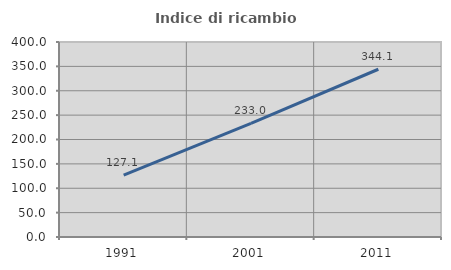
| Category | Indice di ricambio occupazionale  |
|---|---|
| 1991.0 | 127.077 |
| 2001.0 | 233.028 |
| 2011.0 | 344.103 |